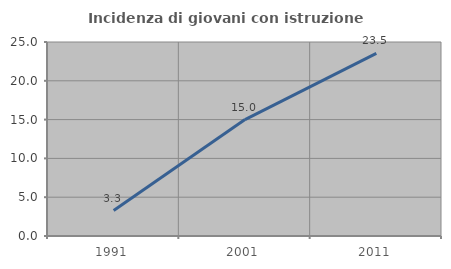
| Category | Incidenza di giovani con istruzione universitaria |
|---|---|
| 1991.0 | 3.279 |
| 2001.0 | 15 |
| 2011.0 | 23.529 |